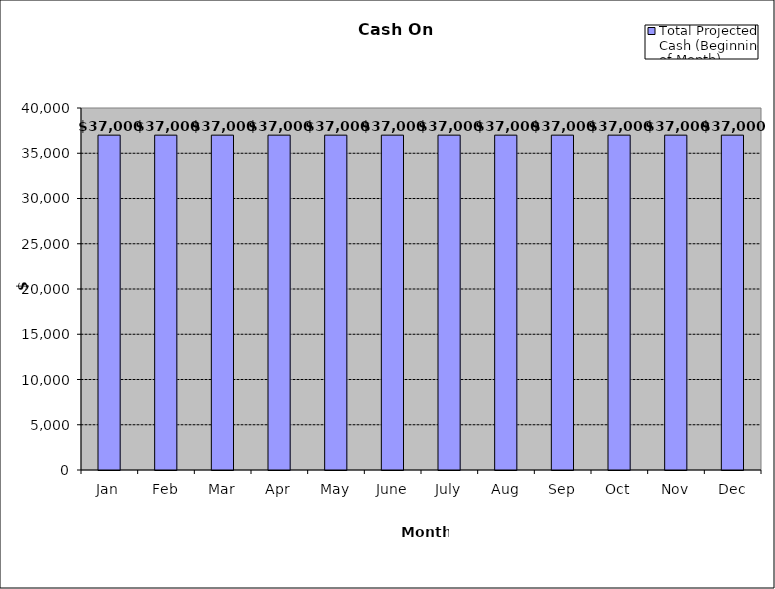
| Category | Total Projected Cash (Beginning of Month) |
|---|---|
| Jan | 37000 |
| Feb | 37000 |
| Mar | 37000 |
| Apr | 37000 |
| May | 37000 |
| June | 37000 |
| July | 37000 |
| Aug | 37000 |
| Sep | 37000 |
| Oct | 37000 |
| Nov | 37000 |
| Dec | 37000 |